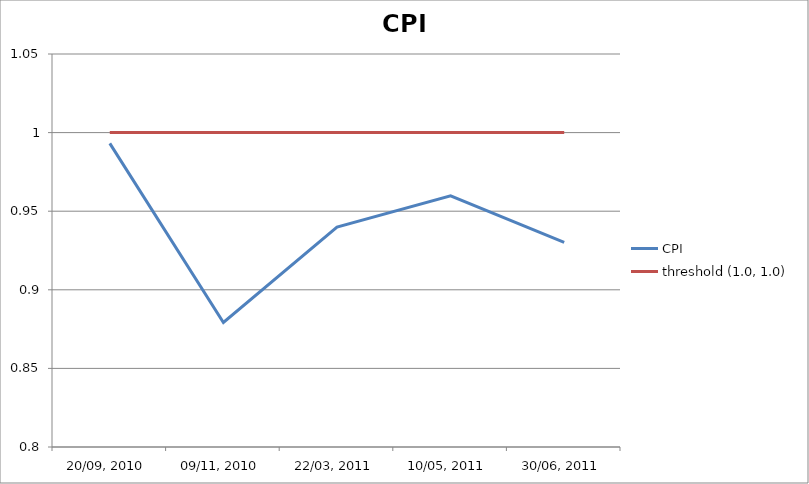
| Category | CPI | threshold (1.0, 1.0) |
|---|---|---|
| 20/09, 2010 | 0.993 | 1 |
| 09/11, 2010 | 0.879 | 1 |
| 22/03, 2011 | 0.94 | 1 |
| 10/05, 2011 | 0.96 | 1 |
| 30/06, 2011 | 0.93 | 1 |